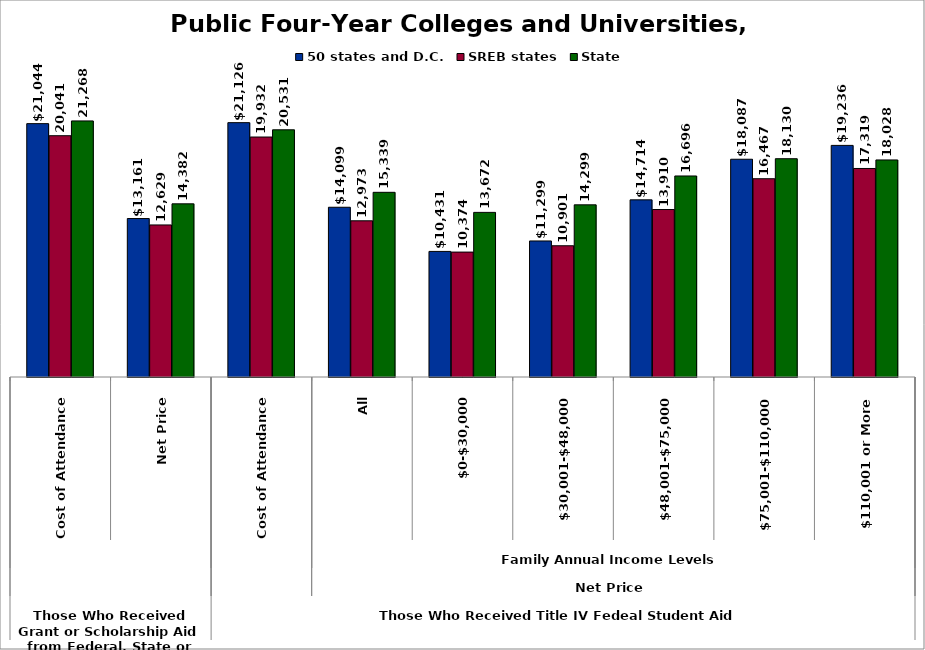
| Category | 50 states and D.C. | SREB states | State |
|---|---|---|---|
| 0 | 21043.97 | 20040.884 | 21268.133 |
| 1 | 13161.375 | 12628.68 | 14382.252 |
| 2 | 21126.125 | 19932.132 | 20530.688 |
| 3 | 14098.653 | 12973.22 | 15339.377 |
| 4 | 10431.225 | 10374.392 | 13671.888 |
| 5 | 11299.294 | 10900.654 | 14298.847 |
| 6 | 14713.691 | 13909.99 | 16695.994 |
| 7 | 18086.606 | 16467.487 | 18130.401 |
| 8 | 19235.757 | 17319.11 | 18028.143 |